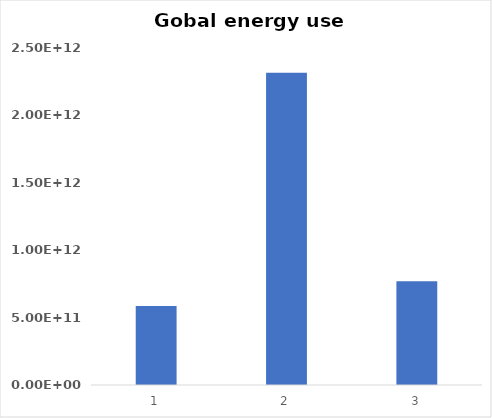
| Category | Series 0 |
|---|---|
| 0 | 585200000000 |
| 1 | 2317007000000 |
| 2 | 770000000000 |